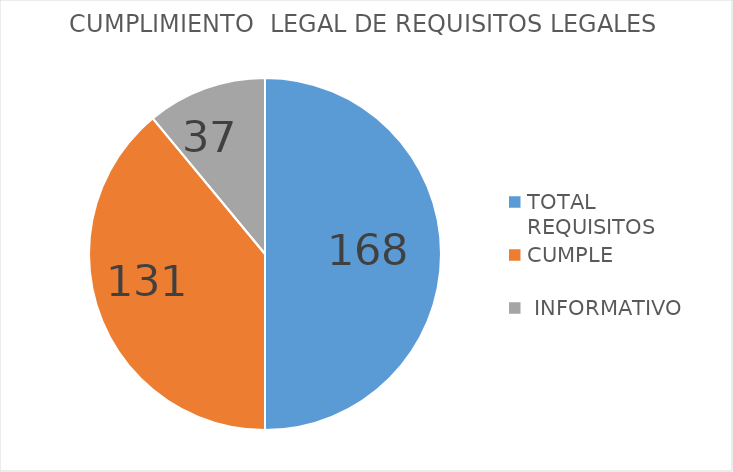
| Category | Series 0 |
|---|---|
| TOTAL REQUISITOS | 168 |
| CUMPLE  | 131 |
|  INFORMATIVO  | 37 |